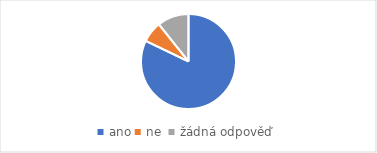
| Category | Series 0 |
|---|---|
| ano | 23 |
| ne  | 2 |
| žádná odpověď | 3 |